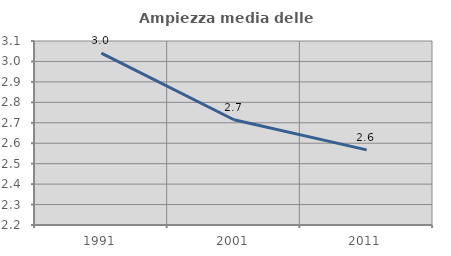
| Category | Ampiezza media delle famiglie |
|---|---|
| 1991.0 | 3.041 |
| 2001.0 | 2.715 |
| 2011.0 | 2.568 |